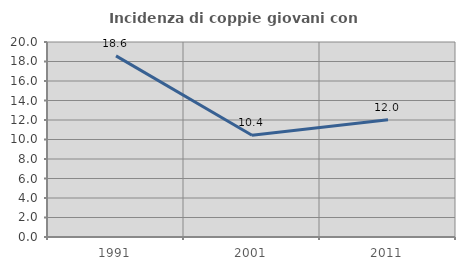
| Category | Incidenza di coppie giovani con figli |
|---|---|
| 1991.0 | 18.576 |
| 2001.0 | 10.435 |
| 2011.0 | 12.035 |